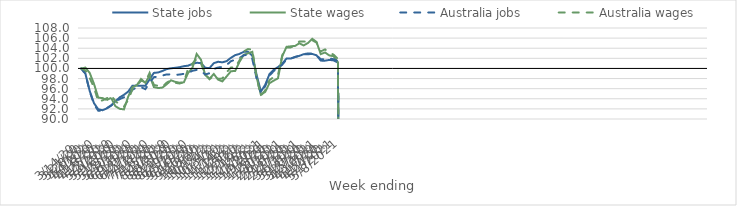
| Category | State jobs | State wages | Australia jobs | Australia wages |
|---|---|---|---|---|
| 14/03/2020 | 100 | 100 | 100 | 100 |
| 21/03/2020 | 98.972 | 100.164 | 98.971 | 99.603 |
| 28/03/2020 | 95.551 | 99.113 | 95.467 | 98.105 |
| 04/04/2020 | 93.127 | 96.958 | 92.92 | 96.234 |
| 11/04/2020 | 91.925 | 94.223 | 91.647 | 93.487 |
| 18/04/2020 | 91.738 | 94.139 | 91.63 | 93.692 |
| 25/04/2020 | 92.088 | 93.746 | 92.16 | 94.108 |
| 02/05/2020 | 92.665 | 94.186 | 92.657 | 94.655 |
| 09/05/2020 | 93.482 | 92.54 | 93.343 | 93.578 |
| 16/05/2020 | 94.277 | 92.016 | 93.935 | 92.812 |
| 23/05/2020 | 94.777 | 91.903 | 94.291 | 92.462 |
| 30/05/2020 | 95.429 | 94.426 | 94.798 | 93.79 |
| 06/06/2020 | 96.597 | 96.293 | 95.781 | 95.926 |
| 13/06/2020 | 96.604 | 96.664 | 96.28 | 96.602 |
| 20/06/2020 | 96.573 | 97.917 | 96.296 | 97.58 |
| 27/06/2020 | 96.552 | 97.147 | 95.902 | 97.326 |
| 04/07/2020 | 97.841 | 98.587 | 97.157 | 99.113 |
| 11/07/2020 | 99.118 | 96.316 | 98.279 | 96.733 |
| 18/07/2020 | 99.206 | 96.117 | 98.382 | 96.561 |
| 25/07/2020 | 99.502 | 96.218 | 98.604 | 96.362 |
| 01/08/2020 | 99.87 | 96.866 | 98.826 | 97.197 |
| 08/08/2020 | 100.031 | 97.653 | 98.822 | 97.652 |
| 15/08/2020 | 100.126 | 97.345 | 98.73 | 97.16 |
| 22/08/2020 | 100.248 | 97.18 | 98.792 | 97.027 |
| 29/08/2020 | 100.446 | 97.256 | 98.928 | 97.246 |
| 05/09/2020 | 100.548 | 99.108 | 99.113 | 99.964 |
| 12/09/2020 | 100.903 | 100.102 | 99.531 | 100.967 |
| 19/09/2020 | 101.117 | 102.867 | 99.714 | 101.852 |
| 26/09/2020 | 101.075 | 101.741 | 99.52 | 101.02 |
| 03/10/2020 | 100.129 | 98.69 | 98.806 | 98.883 |
| 10/10/2020 | 100.072 | 97.954 | 99.055 | 97.873 |
| 17/10/2020 | 101.042 | 98.908 | 99.899 | 98.568 |
| 24/10/2020 | 101.318 | 97.788 | 100.18 | 97.964 |
| 31/10/2020 | 101.209 | 97.435 | 100.306 | 97.998 |
| 07/11/2020 | 101.442 | 98.425 | 100.68 | 99.252 |
| 14/11/2020 | 102.102 | 99.443 | 101.424 | 100.173 |
| 21/11/2020 | 102.632 | 99.51 | 101.745 | 100.229 |
| 28/11/2020 | 102.868 | 101.286 | 102.059 | 101.576 |
| 05/12/2020 | 103.288 | 102.698 | 102.608 | 103.362 |
| 12/12/2020 | 103.281 | 102.985 | 102.679 | 103.837 |
| 19/12/2020 | 102.531 | 103.294 | 101.871 | 103.708 |
| 26/12/2020 | 98.781 | 98.286 | 98.073 | 98.239 |
| 02/01/2021 | 95.426 | 94.807 | 95.142 | 94.651 |
| 09/01/2021 | 96.726 | 95.349 | 96.464 | 95.644 |
| 16/01/2021 | 98.855 | 97.065 | 98.546 | 97.678 |
| 23/01/2021 | 99.748 | 97.587 | 99.493 | 98.293 |
| 30/01/2021 | 100.259 | 98.049 | 99.995 | 98.662 |
| 06/02/2021 | 100.937 | 102.41 | 100.749 | 102.61 |
| 13/02/2021 | 101.966 | 104.276 | 101.78 | 104.166 |
| 20/02/2021 | 101.964 | 104.378 | 101.937 | 104.163 |
| 27/02/2021 | 102.258 | 104.454 | 102.282 | 104.593 |
| 06/03/2021 | 102.492 | 104.982 | 102.496 | 105.335 |
| 13/03/2021 | 102.819 | 104.548 | 102.825 | 105.317 |
| 20/03/2021 | 102.807 | 105.033 | 102.964 | 105.281 |
| 27/03/2021 | 102.876 | 105.868 | 102.951 | 105.588 |
| 03/04/2021 | 102.603 | 105.258 | 102.614 | 105.117 |
| 10/04/2021 | 101.548 | 102.833 | 101.84 | 103.377 |
| 17/04/2021 | 101.539 | 103.161 | 101.797 | 103.762 |
| 24/04/2021 | 101.688 | 102.571 | 102 | 103.175 |
| 01/05/2021 | 101.597 | 102.419 | 101.825 | 102.713 |
| 08/05/2021 | 101.154 | 101.232 | 101.453 | 101.885 |